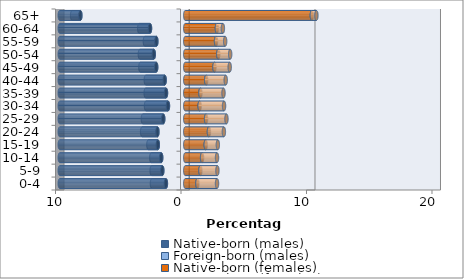
| Category | Native-born (males) | Foreign-born (males) | Native-born (females) | Foreign-born (females) |
|---|---|---|---|---|
| 0-4 | -1.542 | -1.112 | 0.966 | 1.566 |
| 5-9 | -1.829 | -0.846 | 1.208 | 1.355 |
| 10-14 | -1.918 | -0.788 | 1.341 | 1.191 |
| 15-19 | -2.187 | -0.751 | 1.631 | 0.966 |
| 20-24 | -2.218 | -1.218 | 1.887 | 1.191 |
| 25-29 | -1.754 | -1.624 | 1.658 | 1.624 |
| 30-34 | -1.378 | -1.747 | 1.146 | 1.945 |
| 35-39 | -1.535 | -1.617 | 1.211 | 1.836 |
| 40-44 | -1.641 | -1.501 | 1.668 | 1.556 |
| 45-49 | -2.317 | -1.262 | 2.327 | 1.215 |
| 50-54 | -2.508 | -1.109 | 2.631 | 0.949 |
| 55-59 | -2.303 | -0.914 | 2.453 | 0.727 |
| 60-64 | -2.808 | -0.86 | 2.521 | 0.478 |
| 65+ | -8.359 | -0.655 | 10.086 | 0.365 |